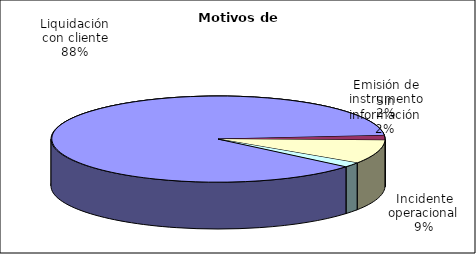
| Category | Motivos |
|---|---|
| Liquidación con cliente | 442 |
| Emisión de instrumento | 9 |
| Incidente operacional | 45 |
| Sin información | 9 |